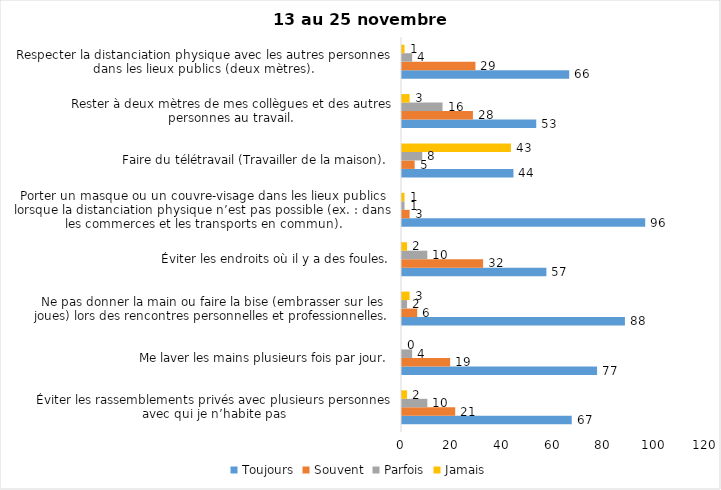
| Category | Toujours | Souvent | Parfois | Jamais |
|---|---|---|---|---|
| Éviter les rassemblements privés avec plusieurs personnes avec qui je n’habite pas | 67 | 21 | 10 | 2 |
| Me laver les mains plusieurs fois par jour. | 77 | 19 | 4 | 0 |
| Ne pas donner la main ou faire la bise (embrasser sur les joues) lors des rencontres personnelles et professionnelles. | 88 | 6 | 2 | 3 |
| Éviter les endroits où il y a des foules. | 57 | 32 | 10 | 2 |
| Porter un masque ou un couvre-visage dans les lieux publics lorsque la distanciation physique n’est pas possible (ex. : dans les commerces et les transports en commun). | 96 | 3 | 1 | 1 |
| Faire du télétravail (Travailler de la maison). | 44 | 5 | 8 | 43 |
| Rester à deux mètres de mes collègues et des autres personnes au travail. | 53 | 28 | 16 | 3 |
| Respecter la distanciation physique avec les autres personnes dans les lieux publics (deux mètres). | 66 | 29 | 4 | 1 |